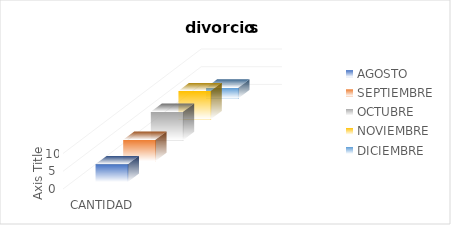
| Category | AGOSTO | SEPTIEMBRE | OCTUBRE | NOVIEMBRE | DICIEMBRE |
|---|---|---|---|---|---|
| CANTIDAD | 5 | 6 | 8 | 8 | 3 |